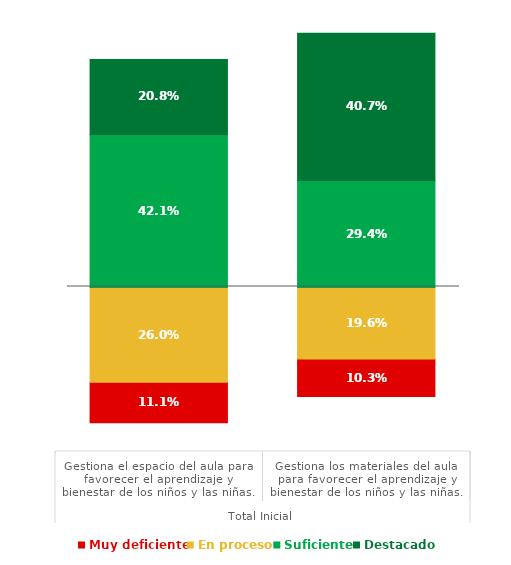
| Category | Series 0 | Muy deficiente | En proceso | Suficiente | Destacado | Series 5 |
|---|---|---|---|---|---|---|
| 0 | 0.079 | 0.111 | 0.26 | 0.421 | 0.208 | 0.221 |
| 1 | 0.151 | 0.103 | 0.196 | 0.294 | 0.407 | 0.149 |